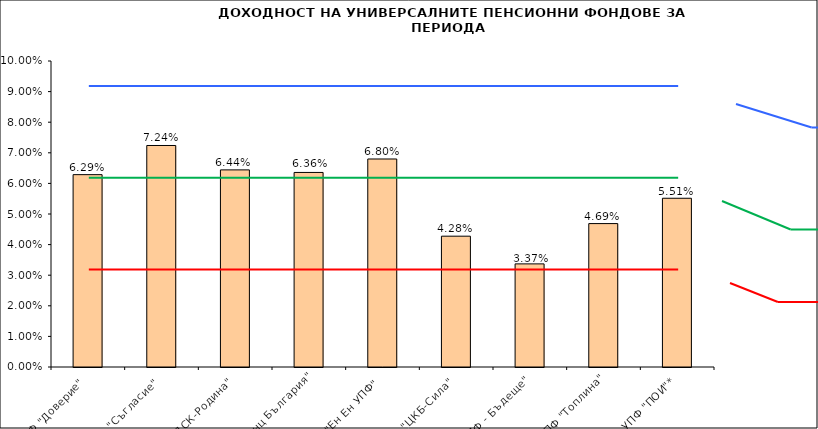
| Category | Series 0 |
|---|---|
| УПФ "Доверие"  | 0.063 |
| УПФ "Съгласие"  | 0.072 |
| УПФ "ДСК-Родина"  | 0.064 |
| "ЗУПФ Алианц България" | 0.064 |
| "Eн Ен УПФ"  | 0.068 |
| УПФ "ЦКБ-Сила"  | 0.043 |
| "УПФ - Бъдеще" | 0.034 |
| УПФ "Топлина" | 0.047 |
| УПФ "ПОИ"* | 0.055 |